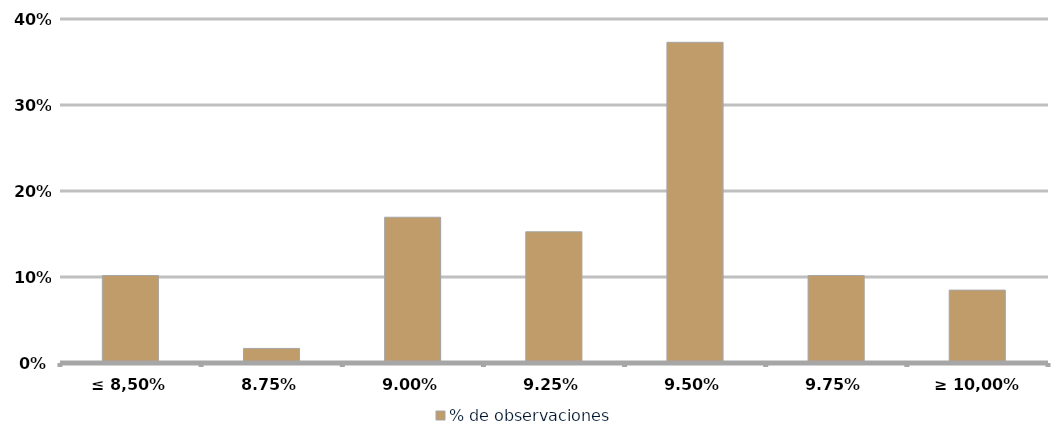
| Category | % de observaciones  |
|---|---|
| ≤ 8,50% | 0.102 |
| 8,75% | 0.017 |
| 9,00% | 0.169 |
| 9,25% | 0.153 |
| 9,50% | 0.373 |
| 9,75% | 0.102 |
| ≥ 10,00% | 0.085 |